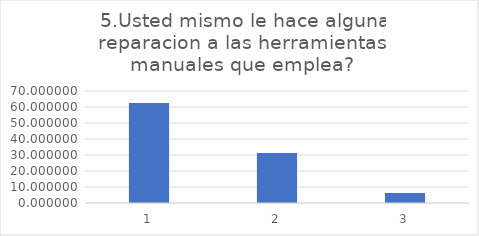
| Category |  Usted mismo le hace alguna reparacion a las herramientas manuales que emplea? |
|---|---|
| 0 | 62.5 |
| 1 | 31.25 |
| 2 | 6.25 |